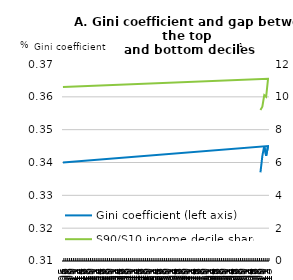
| Category | Gini coefficient (left axis) |
|---|---|
| 2009-01-01 | 0.337 |
| 2010-01-01 | 0.342 |
| 2011-01-01 | 0.345 |
| 2012-01-01 | 0.342 |
| 2013-01-01 | 0.345 |
| 1905-07-06 | 0.34 |